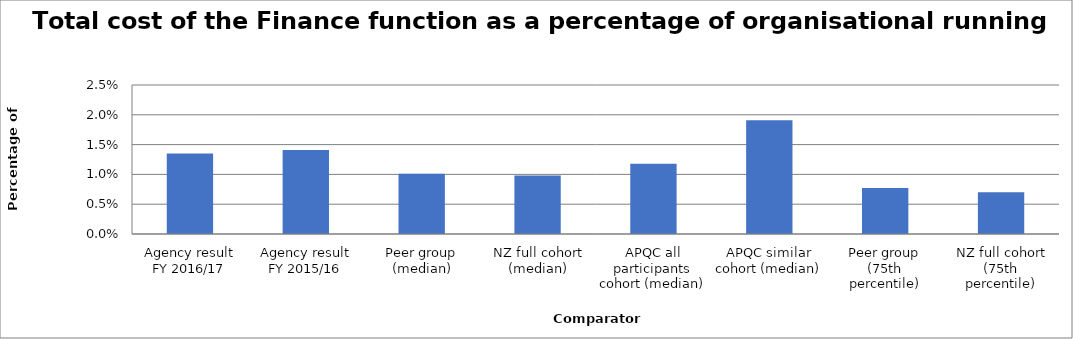
| Category | Result |
|---|---|
| Agency result
FY 2016/17 | 0.014 |
| Agency result
FY 2015/16 | 0.014 |
| Peer group (median) | 0.01 |
| NZ full cohort (median) | 0.01 |
| APQC all participants cohort (median) | 0.012 |
| APQC similar cohort (median) | 0.019 |
| Peer group (75th percentile) | 0.008 |
| NZ full cohort (75th percentile) | 0.007 |